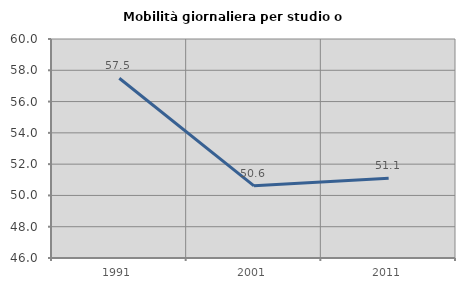
| Category | Mobilità giornaliera per studio o lavoro |
|---|---|
| 1991.0 | 57.488 |
| 2001.0 | 50.613 |
| 2011.0 | 51.104 |